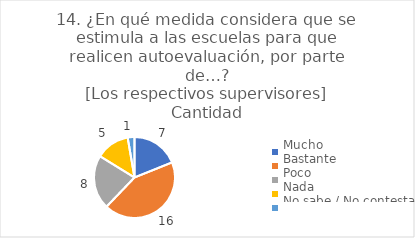
| Category | 14. ¿En qué medida considera que se estimula a las escuelas para que realicen autoevaluación, por parte de…?
[Los respectivos supervisores] |
|---|---|
| Mucho  | 0.189 |
| Bastante  | 0.432 |
| Poco  | 0.216 |
| Nada  | 0.135 |
| No sabe / No contesta | 0.027 |